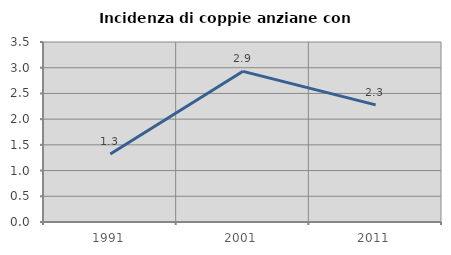
| Category | Incidenza di coppie anziane con figli |
|---|---|
| 1991.0 | 1.322 |
| 2001.0 | 2.93 |
| 2011.0 | 2.277 |